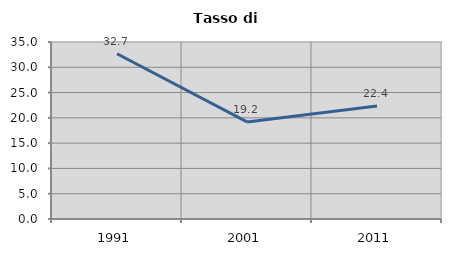
| Category | Tasso di disoccupazione   |
|---|---|
| 1991.0 | 32.682 |
| 2001.0 | 19.196 |
| 2011.0 | 22.362 |